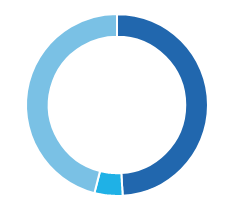
| Category | Series 0 |
|---|---|
| ● EMEA | 0.49 |
| ● Americas | 0.05 |
| ● APAC | 0.46 |